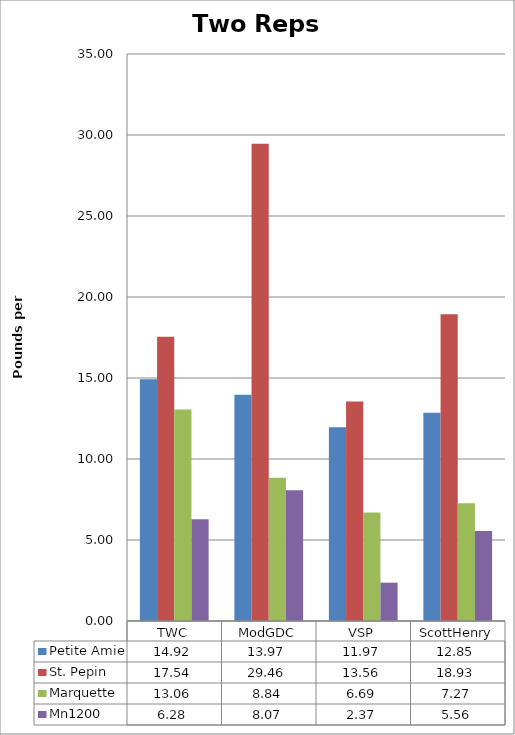
| Category | Petite Amie | St. Pepin | Marquette | Mn1200 |
|---|---|---|---|---|
| 0 | 14.922 | 17.539 | 13.056 | 6.283 |
| 1 | 13.972 | 29.461 | 8.844 | 8.072 |
| 2 | 11.967 | 13.556 | 6.694 | 2.367 |
| 3 | 12.85 | 18.933 | 7.267 | 5.561 |